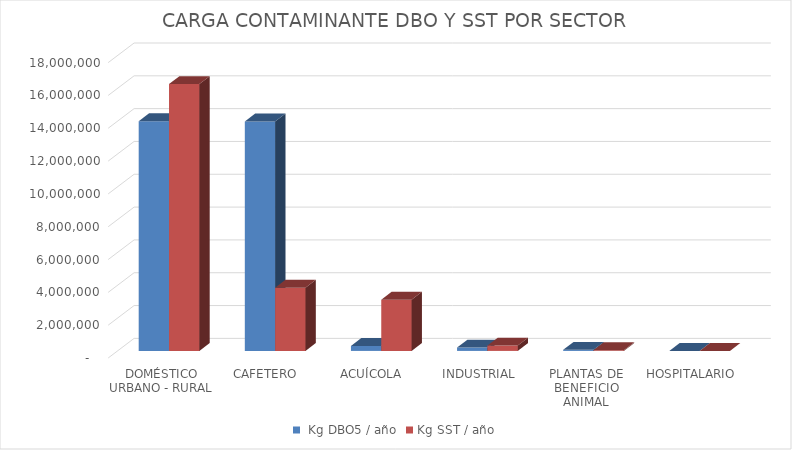
| Category |  Kg DBO5 / año | Kg SST / año |
|---|---|---|
| DOMÉSTICO URBANO - RURAL | 13998436.837 | 16258969.272 |
| CAFETERO | 13988181.547 | 3856346.582 |
| ACUÍCOLA | 305284.99 | 3123633.068 |
| INDUSTRIAL | 205714.1 | 329429.746 |
| PLANTAS DE BENEFICIO ANIMAL | 70949.253 | 43618.29 |
| HOSPITALARIO | 2225.575 | 964.718 |